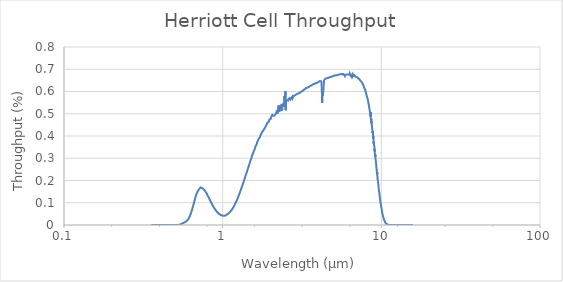
| Category | Throughput (%) |
|---|---|
| 0.355 | 0 |
| 0.365 | 0 |
| 0.375 | 0 |
| 0.385 | 0 |
| 0.395 | 0 |
| 0.405 | 0 |
| 0.415 | 0 |
| 0.425 | 0 |
| 0.435 | 0 |
| 0.445 | 0 |
| 0.455 | 0 |
| 0.465 | 0 |
| 0.475 | 0 |
| 0.485 | 0 |
| 0.495 | 0 |
| 0.505 | 0 |
| 0.515 | 0 |
| 0.525 | 0 |
| 0.535 | 0.001 |
| 0.545 | 0.003 |
| 0.555 | 0.006 |
| 0.565 | 0.009 |
| 0.575 | 0.012 |
| 0.585 | 0.015 |
| 0.595 | 0.019 |
| 0.605 | 0.025 |
| 0.615 | 0.033 |
| 0.625 | 0.045 |
| 0.635 | 0.059 |
| 0.645 | 0.075 |
| 0.655 | 0.092 |
| 0.665 | 0.11 |
| 0.675 | 0.127 |
| 0.685 | 0.141 |
| 0.695 | 0.15 |
| 0.705 | 0.157 |
| 0.715 | 0.161 |
| 0.725 | 0.169 |
| 0.735 | 0.168 |
| 0.745 | 0.165 |
| 0.755 | 0.163 |
| 0.765 | 0.158 |
| 0.775 | 0.152 |
| 0.785 | 0.147 |
| 0.795 | 0.139 |
| 0.805 | 0.131 |
| 0.815 | 0.125 |
| 0.825 | 0.117 |
| 0.835 | 0.11 |
| 0.845 | 0.102 |
| 0.855 | 0.095 |
| 0.865 | 0.088 |
| 0.875 | 0.082 |
| 0.885 | 0.076 |
| 0.895 | 0.071 |
| 0.905 | 0.066 |
| 0.915 | 0.061 |
| 0.925 | 0.058 |
| 0.935 | 0.054 |
| 0.945 | 0.051 |
| 0.955 | 0.048 |
| 0.965 | 0.046 |
| 0.975 | 0.045 |
| 0.985 | 0.043 |
| 0.995 | 0.042 |
| 1.005 | 0.042 |
| 1.015 | 0.042 |
| 1.025 | 0.042 |
| 1.035 | 0.042 |
| 1.045 | 0.043 |
| 1.055 | 0.046 |
| 1.065 | 0.047 |
| 1.075 | 0.049 |
| 1.085 | 0.051 |
| 1.095 | 0.053 |
| 1.105 | 0.056 |
| 1.115 | 0.059 |
| 1.125 | 0.062 |
| 1.135 | 0.066 |
| 1.145 | 0.07 |
| 1.155 | 0.074 |
| 1.165 | 0.078 |
| 1.175 | 0.083 |
| 1.185 | 0.088 |
| 1.195 | 0.093 |
| 1.205 | 0.099 |
| 1.215 | 0.104 |
| 1.225 | 0.11 |
| 1.235 | 0.115 |
| 1.245 | 0.121 |
| 1.255 | 0.128 |
| 1.265 | 0.134 |
| 1.275 | 0.14 |
| 1.285 | 0.147 |
| 1.295 | 0.154 |
| 1.305 | 0.16 |
| 1.315 | 0.167 |
| 1.325 | 0.173 |
| 1.335 | 0.18 |
| 1.345 | 0.187 |
| 1.355 | 0.193 |
| 1.365 | 0.201 |
| 1.375 | 0.207 |
| 1.385 | 0.215 |
| 1.395 | 0.223 |
| 1.405 | 0.227 |
| 1.415 | 0.234 |
| 1.425 | 0.241 |
| 1.435 | 0.249 |
| 1.445 | 0.256 |
| 1.455 | 0.261 |
| 1.465 | 0.268 |
| 1.475 | 0.275 |
| 1.485 | 0.28 |
| 1.495 | 0.288 |
| 1.505 | 0.293 |
| 1.515 | 0.299 |
| 1.525 | 0.306 |
| 1.535 | 0.311 |
| 1.545 | 0.317 |
| 1.555 | 0.321 |
| 1.565 | 0.329 |
| 1.575 | 0.331 |
| 1.585 | 0.338 |
| 1.595 | 0.343 |
| 1.605 | 0.35 |
| 1.615 | 0.351 |
| 1.625 | 0.358 |
| 1.635 | 0.362 |
| 1.645 | 0.366 |
| 1.655 | 0.374 |
| 1.665 | 0.377 |
| 1.675 | 0.377 |
| 1.685 | 0.386 |
| 1.695 | 0.386 |
| 1.705 | 0.39 |
| 1.715 | 0.394 |
| 1.725 | 0.4 |
| 1.735 | 0.401 |
| 1.745 | 0.407 |
| 1.755 | 0.41 |
| 1.765 | 0.415 |
| 1.775 | 0.418 |
| 1.785 | 0.42 |
| 1.795 | 0.423 |
| 1.805 | 0.425 |
| 1.815 | 0.427 |
| 1.825 | 0.428 |
| 1.835 | 0.434 |
| 1.845 | 0.436 |
| 1.855 | 0.439 |
| 1.865 | 0.442 |
| 1.875 | 0.446 |
| 1.885 | 0.446 |
| 1.895 | 0.453 |
| 1.905 | 0.452 |
| 1.915 | 0.461 |
| 1.925 | 0.464 |
| 1.935 | 0.461 |
| 1.945 | 0.462 |
| 1.955 | 0.465 |
| 1.965 | 0.465 |
| 1.975 | 0.475 |
| 1.985 | 0.471 |
| 1.995 | 0.477 |
| 2.005 | 0.476 |
| 2.015 | 0.482 |
| 2.025 | 0.487 |
| 2.035 | 0.487 |
| 2.045 | 0.49 |
| 2.055 | 0.495 |
| 2.065 | 0.493 |
| 2.075 | 0.493 |
| 2.085 | 0.491 |
| 2.095 | 0.495 |
| 2.105 | 0.494 |
| 2.115 | 0.493 |
| 2.125 | 0.493 |
| 2.135 | 0.496 |
| 2.145 | 0.493 |
| 2.155 | 0.498 |
| 2.165 | 0.502 |
| 2.175 | 0.498 |
| 2.185 | 0.508 |
| 2.195 | 0.514 |
| 2.205 | 0.511 |
| 2.215 | 0.501 |
| 2.225 | 0.517 |
| 2.235 | 0.51 |
| 2.245 | 0.508 |
| 2.255 | 0.537 |
| 2.265 | 0.51 |
| 2.275 | 0.521 |
| 2.285 | 0.511 |
| 2.295 | 0.527 |
| 2.305 | 0.526 |
| 2.315 | 0.532 |
| 2.325 | 0.519 |
| 2.335 | 0.528 |
| 2.345 | 0.534 |
| 2.355 | 0.541 |
| 2.365 | 0.514 |
| 2.375 | 0.522 |
| 2.385 | 0.545 |
| 2.395 | 0.547 |
| 2.405 | 0.546 |
| 2.415 | 0.532 |
| 2.425 | 0.534 |
| 2.435 | 0.553 |
| 2.445 | 0.537 |
| 2.455 | 0.579 |
| 2.465 | 0.558 |
| 2.475 | 0.579 |
| 2.485 | 0.602 |
| 2.495 | 0.516 |
| 2.505 | 0.557 |
| 2.515 | 0.557 |
| 2.525 | 0.557 |
| 2.535 | 0.56 |
| 2.545 | 0.559 |
| 2.555 | 0.56 |
| 2.565 | 0.562 |
| 2.575 | 0.561 |
| 2.585 | 0.56 |
| 2.595 | 0.565 |
| 2.61 | 0.562 |
| 2.619 | 0.565 |
| 2.63 | 0.568 |
| 2.64 | 0.57 |
| 2.65 | 0.569 |
| 2.659 | 0.569 |
| 2.67 | 0.564 |
| 2.68 | 0.56 |
| 2.689 | 0.564 |
| 2.7 | 0.57 |
| 2.71 | 0.57 |
| 2.719 | 0.574 |
| 2.73 | 0.57 |
| 2.739 | 0.568 |
| 2.749 | 0.577 |
| 2.76 | 0.57 |
| 2.769 | 0.573 |
| 2.78 | 0.575 |
| 2.789 | 0.574 |
| 2.8 | 0.579 |
| 2.809 | 0.581 |
| 2.82 | 0.58 |
| 2.829 | 0.581 |
| 2.839 | 0.582 |
| 2.849 | 0.583 |
| 2.859 | 0.583 |
| 2.87 | 0.584 |
| 2.879 | 0.585 |
| 2.889 | 0.586 |
| 2.899 | 0.586 |
| 2.909 | 0.587 |
| 2.919 | 0.587 |
| 2.929 | 0.588 |
| 2.939 | 0.589 |
| 2.949 | 0.588 |
| 2.959 | 0.59 |
| 2.969 | 0.592 |
| 2.979 | 0.591 |
| 2.989 | 0.591 |
| 2.999 | 0.591 |
| 3.009 | 0.592 |
| 3.019 | 0.593 |
| 3.029 | 0.592 |
| 3.039 | 0.594 |
| 3.049 | 0.595 |
| 3.059 | 0.594 |
| 3.069 | 0.596 |
| 3.079 | 0.595 |
| 3.089 | 0.597 |
| 3.099 | 0.597 |
| 3.109 | 0.598 |
| 3.119 | 0.599 |
| 3.129 | 0.599 |
| 3.139 | 0.6 |
| 3.149 | 0.6 |
| 3.159 | 0.601 |
| 3.169 | 0.602 |
| 3.179 | 0.603 |
| 3.189 | 0.603 |
| 3.199 | 0.602 |
| 3.209 | 0.604 |
| 3.219 | 0.605 |
| 3.229 | 0.606 |
| 3.239 | 0.607 |
| 3.249 | 0.608 |
| 3.259 | 0.609 |
| 3.269 | 0.608 |
| 3.279 | 0.61 |
| 3.289 | 0.61 |
| 3.299 | 0.611 |
| 3.309 | 0.611 |
| 3.319 | 0.611 |
| 3.329 | 0.612 |
| 3.339 | 0.613 |
| 3.349 | 0.614 |
| 3.359 | 0.616 |
| 3.369 | 0.615 |
| 3.379 | 0.615 |
| 3.389 | 0.616 |
| 3.399 | 0.616 |
| 3.409 | 0.617 |
| 3.419 | 0.616 |
| 3.429 | 0.616 |
| 3.439 | 0.618 |
| 3.449 | 0.618 |
| 3.459 | 0.62 |
| 3.469 | 0.62 |
| 3.479 | 0.622 |
| 3.489 | 0.621 |
| 3.499 | 0.621 |
| 3.509 | 0.622 |
| 3.519 | 0.622 |
| 3.529 | 0.621 |
| 3.539 | 0.623 |
| 3.549 | 0.625 |
| 3.559 | 0.626 |
| 3.569 | 0.625 |
| 3.579 | 0.625 |
| 3.589 | 0.626 |
| 3.599 | 0.626 |
| 3.609 | 0.626 |
| 3.619 | 0.628 |
| 3.629 | 0.628 |
| 3.639 | 0.628 |
| 3.649 | 0.629 |
| 3.659 | 0.629 |
| 3.669 | 0.629 |
| 3.679 | 0.629 |
| 3.689 | 0.631 |
| 3.699 | 0.632 |
| 3.709 | 0.632 |
| 3.719 | 0.633 |
| 3.729 | 0.634 |
| 3.739 | 0.633 |
| 3.749 | 0.632 |
| 3.759 | 0.633 |
| 3.769 | 0.635 |
| 3.779 | 0.634 |
| 3.789 | 0.635 |
| 3.799 | 0.635 |
| 3.809 | 0.636 |
| 3.819 | 0.635 |
| 3.829 | 0.637 |
| 3.839 | 0.636 |
| 3.849 | 0.637 |
| 3.859 | 0.638 |
| 3.869 | 0.637 |
| 3.879 | 0.638 |
| 3.889 | 0.638 |
| 3.899 | 0.64 |
| 3.909 | 0.64 |
| 3.919 | 0.64 |
| 3.929 | 0.638 |
| 3.939 | 0.639 |
| 3.949 | 0.639 |
| 3.959 | 0.641 |
| 3.968 | 0.641 |
| 3.979 | 0.642 |
| 3.989 | 0.641 |
| 3.999 | 0.641 |
| 4.009 | 0.643 |
| 4.018 | 0.643 |
| 4.029 | 0.645 |
| 4.039 | 0.644 |
| 4.049 | 0.644 |
| 4.058 | 0.646 |
| 4.069 | 0.646 |
| 4.078 | 0.646 |
| 4.089 | 0.645 |
| 4.098 | 0.646 |
| 4.109 | 0.646 |
| 4.118 | 0.647 |
| 4.129 | 0.648 |
| 4.138 | 0.649 |
| 4.148 | 0.648 |
| 4.159 | 0.65 |
| 4.168 | 0.649 |
| 4.178 | 0.649 |
| 4.189 | 0.645 |
| 4.198 | 0.635 |
| 4.208 | 0.62 |
| 4.218 | 0.603 |
| 4.228 | 0.557 |
| 4.238 | 0.55 |
| 4.248 | 0.565 |
| 4.258 | 0.596 |
| 4.268 | 0.583 |
| 4.278 | 0.582 |
| 4.288 | 0.585 |
| 4.298 | 0.594 |
| 4.308 | 0.602 |
| 4.318 | 0.61 |
| 4.328 | 0.626 |
| 4.338 | 0.634 |
| 4.348 | 0.639 |
| 4.358 | 0.649 |
| 4.368 | 0.652 |
| 4.378 | 0.653 |
| 4.388 | 0.654 |
| 4.398 | 0.657 |
| 4.408 | 0.656 |
| 4.418 | 0.655 |
| 4.428 | 0.656 |
| 4.438 | 0.656 |
| 4.448 | 0.657 |
| 4.458 | 0.658 |
| 4.468 | 0.659 |
| 4.478 | 0.658 |
| 4.488 | 0.658 |
| 4.498 | 0.659 |
| 4.508 | 0.659 |
| 4.518 | 0.659 |
| 4.528 | 0.66 |
| 4.538 | 0.66 |
| 4.548 | 0.66 |
| 4.558 | 0.659 |
| 4.568 | 0.661 |
| 4.578 | 0.661 |
| 4.588 | 0.661 |
| 4.598 | 0.661 |
| 4.608 | 0.66 |
| 4.618 | 0.661 |
| 4.628 | 0.662 |
| 4.638 | 0.661 |
| 4.648 | 0.663 |
| 4.658 | 0.664 |
| 4.668 | 0.663 |
| 4.678 | 0.663 |
| 4.688 | 0.663 |
| 4.698 | 0.663 |
| 4.708 | 0.663 |
| 4.718 | 0.664 |
| 4.728 | 0.664 |
| 4.738 | 0.665 |
| 4.748 | 0.665 |
| 4.758 | 0.665 |
| 4.768 | 0.666 |
| 4.778 | 0.666 |
| 4.788 | 0.665 |
| 4.798 | 0.666 |
| 4.808 | 0.666 |
| 4.818 | 0.666 |
| 4.828 | 0.666 |
| 4.838 | 0.667 |
| 4.848 | 0.667 |
| 4.858 | 0.667 |
| 4.868 | 0.668 |
| 4.878 | 0.667 |
| 4.888 | 0.667 |
| 4.898 | 0.667 |
| 4.908 | 0.669 |
| 4.918 | 0.669 |
| 4.928 | 0.669 |
| 4.938 | 0.669 |
| 4.948 | 0.669 |
| 4.958 | 0.669 |
| 4.968 | 0.669 |
| 4.978 | 0.669 |
| 4.988 | 0.67 |
| 4.998 | 0.669 |
| 5.008 | 0.669 |
| 5.018 | 0.669 |
| 5.028 | 0.67 |
| 5.038 | 0.672 |
| 5.048 | 0.672 |
| 5.058 | 0.672 |
| 5.068 | 0.672 |
| 5.078 | 0.671 |
| 5.088 | 0.671 |
| 5.098 | 0.672 |
| 5.107 | 0.673 |
| 5.118 | 0.673 |
| 5.128 | 0.672 |
| 5.138 | 0.672 |
| 5.147 | 0.672 |
| 5.158 | 0.672 |
| 5.168 | 0.673 |
| 5.178 | 0.673 |
| 5.187 | 0.674 |
| 5.198 | 0.674 |
| 5.208 | 0.673 |
| 5.218 | 0.674 |
| 5.227 | 0.674 |
| 5.238 | 0.674 |
| 5.248 | 0.675 |
| 5.257 | 0.675 |
| 5.268 | 0.674 |
| 5.278 | 0.674 |
| 5.288 | 0.674 |
| 5.297 | 0.674 |
| 5.308 | 0.676 |
| 5.318 | 0.675 |
| 5.327 | 0.675 |
| 5.337 | 0.676 |
| 5.348 | 0.674 |
| 5.358 | 0.674 |
| 5.367 | 0.675 |
| 5.378 | 0.677 |
| 5.388 | 0.677 |
| 5.397 | 0.677 |
| 5.407 | 0.675 |
| 5.418 | 0.674 |
| 5.428 | 0.673 |
| 5.437 | 0.674 |
| 5.448 | 0.677 |
| 5.458 | 0.676 |
| 5.467 | 0.674 |
| 5.477 | 0.674 |
| 5.488 | 0.675 |
| 5.497 | 0.677 |
| 5.507 | 0.677 |
| 5.518 | 0.676 |
| 5.527 | 0.677 |
| 5.537 | 0.678 |
| 5.548 | 0.677 |
| 5.558 | 0.676 |
| 5.567 | 0.677 |
| 5.578 | 0.676 |
| 5.588 | 0.677 |
| 5.597 | 0.678 |
| 5.608 | 0.678 |
| 5.618 | 0.678 |
| 5.627 | 0.679 |
| 5.637 | 0.678 |
| 5.648 | 0.675 |
| 5.657 | 0.676 |
| 5.667 | 0.677 |
| 5.678 | 0.678 |
| 5.687 | 0.677 |
| 5.697 | 0.678 |
| 5.707 | 0.678 |
| 5.717 | 0.673 |
| 5.727 | 0.674 |
| 5.737 | 0.676 |
| 5.747 | 0.678 |
| 5.758 | 0.678 |
| 5.767 | 0.676 |
| 5.777 | 0.674 |
| 5.788 | 0.678 |
| 5.797 | 0.679 |
| 5.807 | 0.68 |
| 5.818 | 0.677 |
| 5.827 | 0.674 |
| 5.837 | 0.675 |
| 5.847 | 0.679 |
| 5.857 | 0.678 |
| 5.867 | 0.677 |
| 5.877 | 0.675 |
| 5.887 | 0.67 |
| 5.898 | 0.672 |
| 5.907 | 0.675 |
| 5.917 | 0.677 |
| 5.927 | 0.676 |
| 5.937 | 0.673 |
| 5.947 | 0.672 |
| 5.957 | 0.676 |
| 5.967 | 0.677 |
| 5.978 | 0.677 |
| 5.987 | 0.676 |
| 5.997 | 0.676 |
| 6.007 | 0.677 |
| 6.017 | 0.677 |
| 6.027 | 0.678 |
| 6.037 | 0.68 |
| 6.047 | 0.679 |
| 6.057 | 0.672 |
| 6.067 | 0.672 |
| 6.077 | 0.672 |
| 6.087 | 0.677 |
| 6.097 | 0.678 |
| 6.107 | 0.677 |
| 6.117 | 0.674 |
| 6.127 | 0.675 |
| 6.137 | 0.676 |
| 6.147 | 0.675 |
| 6.157 | 0.674 |
| 6.167 | 0.675 |
| 6.177 | 0.677 |
| 6.187 | 0.676 |
| 6.197 | 0.676 |
| 6.207 | 0.677 |
| 6.217 | 0.677 |
| 6.227 | 0.677 |
| 6.237 | 0.678 |
| 6.247 | 0.679 |
| 6.257 | 0.679 |
| 6.267 | 0.678 |
| 6.277 | 0.676 |
| 6.287 | 0.676 |
| 6.297 | 0.677 |
| 6.307 | 0.679 |
| 6.317 | 0.682 |
| 6.327 | 0.682 |
| 6.337 | 0.679 |
| 6.347 | 0.676 |
| 6.357 | 0.677 |
| 6.367 | 0.677 |
| 6.377 | 0.676 |
| 6.387 | 0.677 |
| 6.397 | 0.68 |
| 6.407 | 0.678 |
| 6.417 | 0.672 |
| 6.427 | 0.67 |
| 6.437 | 0.671 |
| 6.446 | 0.673 |
| 6.457 | 0.676 |
| 6.467 | 0.676 |
| 6.477 | 0.675 |
| 6.487 | 0.672 |
| 6.497 | 0.67 |
| 6.507 | 0.671 |
| 6.517 | 0.672 |
| 6.527 | 0.673 |
| 6.537 | 0.674 |
| 6.547 | 0.674 |
| 6.557 | 0.674 |
| 6.567 | 0.67 |
| 6.577 | 0.669 |
| 6.587 | 0.669 |
| 6.597 | 0.672 |
| 6.607 | 0.673 |
| 6.617 | 0.674 |
| 6.627 | 0.67 |
| 6.637 | 0.667 |
| 6.647 | 0.668 |
| 6.657 | 0.671 |
| 6.666 | 0.674 |
| 6.677 | 0.673 |
| 6.686 | 0.673 |
| 6.697 | 0.673 |
| 6.706 | 0.672 |
| 6.717 | 0.67 |
| 6.726 | 0.671 |
| 6.737 | 0.675 |
| 6.746 | 0.675 |
| 6.757 | 0.676 |
| 6.766 | 0.674 |
| 6.777 | 0.672 |
| 6.787 | 0.67 |
| 6.797 | 0.672 |
| 6.807 | 0.673 |
| 6.816 | 0.674 |
| 6.827 | 0.673 |
| 6.836 | 0.672 |
| 6.847 | 0.672 |
| 6.856 | 0.67 |
| 6.867 | 0.667 |
| 6.876 | 0.668 |
| 6.887 | 0.67 |
| 6.897 | 0.67 |
| 6.906 | 0.669 |
| 6.917 | 0.668 |
| 6.926 | 0.669 |
| 6.937 | 0.669 |
| 6.946 | 0.669 |
| 6.956 | 0.667 |
| 6.967 | 0.665 |
| 6.976 | 0.665 |
| 6.987 | 0.666 |
| 6.996 | 0.666 |
| 7.007 | 0.665 |
| 7.016 | 0.665 |
| 7.026 | 0.664 |
| 7.037 | 0.662 |
| 7.046 | 0.661 |
| 7.057 | 0.661 |
| 7.066 | 0.663 |
| 7.076 | 0.663 |
| 7.087 | 0.663 |
| 7.096 | 0.663 |
| 7.107 | 0.662 |
| 7.116 | 0.661 |
| 7.126 | 0.661 |
| 7.137 | 0.66 |
| 7.146 | 0.659 |
| 7.156 | 0.658 |
| 7.166 | 0.658 |
| 7.176 | 0.659 |
| 7.187 | 0.659 |
| 7.196 | 0.659 |
| 7.206 | 0.658 |
| 7.217 | 0.658 |
| 7.226 | 0.658 |
| 7.236 | 0.659 |
| 7.246 | 0.658 |
| 7.256 | 0.657 |
| 7.266 | 0.656 |
| 7.276 | 0.655 |
| 7.286 | 0.655 |
| 7.296 | 0.656 |
| 7.306 | 0.656 |
| 7.316 | 0.655 |
| 7.327 | 0.654 |
| 7.336 | 0.652 |
| 7.346 | 0.65 |
| 7.357 | 0.65 |
| 7.366 | 0.65 |
| 7.376 | 0.651 |
| 7.386 | 0.651 |
| 7.396 | 0.651 |
| 7.406 | 0.651 |
| 7.416 | 0.65 |
| 7.426 | 0.65 |
| 7.436 | 0.649 |
| 7.446 | 0.647 |
| 7.456 | 0.646 |
| 7.466 | 0.644 |
| 7.476 | 0.643 |
| 7.486 | 0.644 |
| 7.496 | 0.644 |
| 7.506 | 0.644 |
| 7.516 | 0.643 |
| 7.526 | 0.642 |
| 7.536 | 0.641 |
| 7.546 | 0.641 |
| 7.556 | 0.64 |
| 7.566 | 0.64 |
| 7.576 | 0.639 |
| 7.586 | 0.638 |
| 7.596 | 0.637 |
| 7.606 | 0.637 |
| 7.616 | 0.636 |
| 7.626 | 0.635 |
| 7.636 | 0.634 |
| 7.646 | 0.633 |
| 7.656 | 0.633 |
| 7.666 | 0.632 |
| 7.676 | 0.63 |
| 7.686 | 0.629 |
| 7.696 | 0.628 |
| 7.706 | 0.628 |
| 7.716 | 0.627 |
| 7.726 | 0.626 |
| 7.736 | 0.625 |
| 7.746 | 0.623 |
| 7.756 | 0.622 |
| 7.766 | 0.621 |
| 7.776 | 0.62 |
| 7.786 | 0.619 |
| 7.796 | 0.618 |
| 7.806 | 0.617 |
| 7.816 | 0.616 |
| 7.826 | 0.615 |
| 7.836 | 0.614 |
| 7.846 | 0.614 |
| 7.855 | 0.613 |
| 7.866 | 0.612 |
| 7.876 | 0.611 |
| 7.886 | 0.61 |
| 7.896 | 0.608 |
| 7.905 | 0.606 |
| 7.916 | 0.604 |
| 7.926 | 0.603 |
| 7.936 | 0.602 |
| 7.946 | 0.601 |
| 7.955 | 0.6 |
| 7.966 | 0.599 |
| 7.976 | 0.598 |
| 7.986 | 0.597 |
| 7.996 | 0.595 |
| 8.005 | 0.594 |
| 8.016 | 0.592 |
| 8.026 | 0.591 |
| 8.036 | 0.589 |
| 8.046 | 0.587 |
| 8.056 | 0.586 |
| 8.065 | 0.585 |
| 8.075 | 0.584 |
| 8.086 | 0.582 |
| 8.096 | 0.581 |
| 8.106 | 0.579 |
| 8.116 | 0.577 |
| 8.125 | 0.576 |
| 8.135 | 0.574 |
| 8.146 | 0.573 |
| 8.156 | 0.572 |
| 8.166 | 0.571 |
| 8.176 | 0.57 |
| 8.186 | 0.569 |
| 8.195 | 0.567 |
| 8.205 | 0.565 |
| 8.215 | 0.564 |
| 8.226 | 0.562 |
| 8.236 | 0.559 |
| 8.246 | 0.557 |
| 8.256 | 0.555 |
| 8.266 | 0.554 |
| 8.275 | 0.552 |
| 8.285 | 0.551 |
| 8.295 | 0.548 |
| 8.305 | 0.546 |
| 8.315 | 0.544 |
| 8.326 | 0.541 |
| 8.336 | 0.539 |
| 8.346 | 0.537 |
| 8.356 | 0.535 |
| 8.366 | 0.533 |
| 8.375 | 0.531 |
| 8.385 | 0.528 |
| 8.395 | 0.526 |
| 8.405 | 0.524 |
| 8.415 | 0.522 |
| 8.425 | 0.52 |
| 8.435 | 0.518 |
| 8.445 | 0.516 |
| 8.455 | 0.513 |
| 8.465 | 0.51 |
| 8.476 | 0.508 |
| 8.486 | 0.505 |
| 8.496 | 0.503 |
| 8.506 | 0.501 |
| 8.516 | 0.502 |
| 8.526 | 0.503 |
| 8.536 | 0.494 |
| 8.555 | 0.489 |
| 8.565 | 0.507 |
| 8.575 | 0.488 |
| 8.585 | 0.485 |
| 8.595 | 0.478 |
| 8.605 | 0.474 |
| 8.615 | 0.47 |
| 8.625 | 0.479 |
| 8.635 | 0.469 |
| 8.645 | 0.463 |
| 8.655 | 0.457 |
| 8.665 | 0.462 |
| 8.675 | 0.468 |
| 8.685 | 0.463 |
| 8.695 | 0.454 |
| 8.705 | 0.449 |
| 8.715 | 0.452 |
| 8.735 | 0.439 |
| 8.745 | 0.435 |
| 8.755 | 0.433 |
| 8.765 | 0.436 |
| 8.775 | 0.428 |
| 8.785 | 0.426 |
| 8.795 | 0.424 |
| 8.805 | 0.414 |
| 8.815 | 0.42 |
| 8.825 | 0.417 |
| 8.835 | 0.416 |
| 8.845 | 0.416 |
| 8.855 | 0.418 |
| 8.865 | 0.406 |
| 8.875 | 0.399 |
| 8.885 | 0.389 |
| 8.895 | 0.398 |
| 8.905 | 0.388 |
| 8.925 | 0.386 |
| 8.935 | 0.379 |
| 8.945 | 0.382 |
| 8.955 | 0.365 |
| 8.965 | 0.374 |
| 8.975 | 0.376 |
| 8.985 | 0.365 |
| 8.995 | 0.359 |
| 9.005 | 0.361 |
| 9.015 | 0.357 |
| 9.035 | 0.354 |
| 9.045 | 0.35 |
| 9.055 | 0.342 |
| 9.065 | 0.336 |
| 9.075 | 0.341 |
| 9.085 | 0.328 |
| 9.095 | 0.332 |
| 9.115 | 0.319 |
| 9.125 | 0.322 |
| 9.135 | 0.318 |
| 9.145 | 0.311 |
| 9.155 | 0.317 |
| 9.175 | 0.305 |
| 9.185 | 0.307 |
| 9.195 | 0.297 |
| 9.205 | 0.294 |
| 9.215 | 0.291 |
| 9.235 | 0.289 |
| 9.245 | 0.287 |
| 9.255 | 0.281 |
| 9.265 | 0.279 |
| 9.275 | 0.273 |
| 9.295 | 0.267 |
| 9.305 | 0.259 |
| 9.314 | 0.259 |
| 9.325 | 0.254 |
| 9.345 | 0.251 |
| 9.355 | 0.248 |
| 9.364 | 0.247 |
| 9.375 | 0.237 |
| 9.385 | 0.24 |
| 9.395 | 0.232 |
| 9.404 | 0.231 |
| 9.415 | 0.237 |
| 9.425 | 0.224 |
| 9.435 | 0.228 |
| 9.444 | 0.223 |
| 9.455 | 0.221 |
| 9.465 | 0.212 |
| 9.475 | 0.207 |
| 9.484 | 0.208 |
| 9.495 | 0.202 |
| 9.505 | 0.203 |
| 9.515 | 0.198 |
| 9.524 | 0.204 |
| 9.535 | 0.194 |
| 9.545 | 0.196 |
| 9.554 | 0.191 |
| 9.564 | 0.184 |
| 9.575 | 0.181 |
| 9.585 | 0.181 |
| 9.594 | 0.177 |
| 9.605 | 0.171 |
| 9.615 | 0.17 |
| 9.624 | 0.164 |
| 9.634 | 0.163 |
| 9.645 | 0.157 |
| 9.654 | 0.159 |
| 9.664 | 0.161 |
| 9.675 | 0.152 |
| 9.684 | 0.155 |
| 9.694 | 0.147 |
| 9.705 | 0.146 |
| 9.714 | 0.146 |
| 9.724 | 0.141 |
| 9.735 | 0.136 |
| 9.744 | 0.132 |
| 9.754 | 0.136 |
| 9.765 | 0.131 |
| 9.774 | 0.127 |
| 9.784 | 0.125 |
| 9.795 | 0.12 |
| 9.804 | 0.122 |
| 9.815 | 0.118 |
| 9.824 | 0.115 |
| 9.834 | 0.115 |
| 9.845 | 0.113 |
| 9.854 | 0.111 |
| 9.864 | 0.106 |
| 9.875 | 0.101 |
| 9.884 | 0.103 |
| 9.895 | 0.099 |
| 9.904 | 0.098 |
| 9.914 | 0.098 |
| 9.924 | 0.093 |
| 9.934 | 0.092 |
| 9.945 | 0.089 |
| 9.954 | 0.088 |
| 9.964 | 0.083 |
| 9.974 | 0.082 |
| 9.984 | 0.079 |
| 9.994 | 0.08 |
| 10.004 | 0.08 |
| 10.015 | 0.077 |
| 10.024 | 0.079 |
| 10.034 | 0.073 |
| 10.044 | 0.074 |
| 10.054 | 0.071 |
| 10.064 | 0.068 |
| 10.074 | 0.067 |
| 10.084 | 0.065 |
| 10.094 | 0.062 |
| 10.104 | 0.062 |
| 10.114 | 0.056 |
| 10.124 | 0.059 |
| 10.134 | 0.056 |
| 10.144 | 0.055 |
| 10.154 | 0.052 |
| 10.164 | 0.053 |
| 10.174 | 0.051 |
| 10.184 | 0.052 |
| 10.194 | 0.047 |
| 10.204 | 0.047 |
| 10.214 | 0.045 |
| 10.224 | 0.044 |
| 10.234 | 0.041 |
| 10.244 | 0.039 |
| 10.254 | 0.041 |
| 10.264 | 0.04 |
| 10.274 | 0.037 |
| 10.284 | 0.037 |
| 10.294 | 0.037 |
| 10.304 | 0.034 |
| 10.314 | 0.032 |
| 10.324 | 0.033 |
| 10.334 | 0.032 |
| 10.344 | 0.029 |
| 10.354 | 0.029 |
| 10.364 | 0.027 |
| 10.374 | 0.028 |
| 10.384 | 0.027 |
| 10.394 | 0.026 |
| 10.404 | 0.024 |
| 10.414 | 0.026 |
| 10.424 | 0.023 |
| 10.434 | 0.023 |
| 10.444 | 0.021 |
| 10.454 | 0.02 |
| 10.464 | 0.02 |
| 10.474 | 0.019 |
| 10.484 | 0.019 |
| 10.494 | 0.017 |
| 10.504 | 0.016 |
| 10.514 | 0.017 |
| 10.524 | 0.017 |
| 10.534 | 0.015 |
| 10.544 | 0.014 |
| 10.554 | 0.014 |
| 10.564 | 0.012 |
| 10.574 | 0.012 |
| 10.584 | 0.013 |
| 10.594 | 0.012 |
| 10.604 | 0.01 |
| 10.614 | 0.01 |
| 10.624 | 0.011 |
| 10.634 | 0.011 |
| 10.644 | 0.009 |
| 10.654 | 0.009 |
| 10.664 | 0.008 |
| 10.674 | 0.009 |
| 10.684 | 0.008 |
| 10.694 | 0.007 |
| 10.704 | 0.007 |
| 10.714 | 0.008 |
| 10.723 | 0.006 |
| 10.734 | 0.005 |
| 10.744 | 0.006 |
| 10.754 | 0.005 |
| 10.763 | 0.005 |
| 10.774 | 0.006 |
| 10.784 | 0.004 |
| 10.794 | 0.005 |
| 10.803 | 0.004 |
| 10.814 | 0.004 |
| 10.824 | 0.003 |
| 10.834 | 0.004 |
| 10.843 | 0.004 |
| 10.854 | 0.003 |
| 10.864 | 0.003 |
| 10.874 | 0.003 |
| 10.883 | 0.003 |
| 10.893 | 0.003 |
| 10.904 | 0.002 |
| 10.914 | 0.003 |
| 10.924 | 0.002 |
| 10.933 | 0.002 |
| 10.943 | 0.002 |
| 10.954 | 0.002 |
| 10.964 | 0.002 |
| 10.974 | 0.002 |
| 10.984 | 0.002 |
| 10.993 | 0.001 |
| 11.003 | 0.001 |
| 11.014 | 0.001 |
| 11.024 | 0.001 |
| 11.034 | 0.001 |
| 11.044 | 0.001 |
| 11.053 | 0.001 |
| 11.063 | 0.001 |
| 11.073 | 0.001 |
| 11.083 | 0.001 |
| 11.094 | 0.001 |
| 11.104 | 0.001 |
| 11.114 | 0.001 |
| 11.124 | 0.001 |
| 11.133 | 0.001 |
| 11.143 | 0.001 |
| 11.153 | 0.001 |
| 11.163 | 0.001 |
| 11.173 | 0.001 |
| 11.183 | 0.001 |
| 11.193 | 0 |
| 11.204 | 0 |
| 11.214 | 0 |
| 11.224 | 0 |
| 11.234 | 0 |
| 11.244 | 0 |
| 11.254 | 0 |
| 11.264 | 0 |
| 11.273 | 0 |
| 11.283 | 0 |
| 11.293 | 0 |
| 11.303 | 0 |
| 11.313 | 0 |
| 11.323 | 0 |
| 11.333 | 0 |
| 11.343 | 0 |
| 11.353 | 0 |
| 11.363 | 0 |
| 11.373 | 0 |
| 11.383 | 0 |
| 11.393 | 0 |
| 11.403 | 0 |
| 11.413 | 0 |
| 11.423 | 0 |
| 11.433 | 0 |
| 11.443 | 0 |
| 11.453 | 0 |
| 11.464 | 0 |
| 11.474 | 0 |
| 11.483 | 0 |
| 11.493 | 0 |
| 11.503 | 0 |
| 11.513 | 0 |
| 11.523 | 0 |
| 11.533 | 0 |
| 11.543 | 0 |
| 11.553 | 0 |
| 11.563 | 0 |
| 11.573 | 0 |
| 11.583 | 0 |
| 11.593 | 0 |
| 11.603 | 0 |
| 11.613 | 0 |
| 11.623 | 0 |
| 11.633 | 0 |
| 11.643 | 0 |
| 11.653 | 0 |
| 11.663 | 0 |
| 11.673 | 0 |
| 11.683 | 0 |
| 11.693 | 0 |
| 11.703 | 0 |
| 11.713 | 0 |
| 11.723 | 0 |
| 11.733 | 0 |
| 11.743 | 0 |
| 11.753 | 0 |
| 11.763 | 0 |
| 11.773 | 0 |
| 11.783 | 0 |
| 11.793 | 0 |
| 11.803 | 0 |
| 11.813 | 0 |
| 11.823 | 0 |
| 11.833 | 0 |
| 11.843 | 0 |
| 11.853 | 0 |
| 11.863 | 0 |
| 11.873 | 0 |
| 11.883 | 0 |
| 11.893 | 0 |
| 11.903 | 0 |
| 11.913 | 0 |
| 11.923 | 0 |
| 11.933 | 0 |
| 11.943 | 0 |
| 11.953 | 0 |
| 11.963 | 0 |
| 11.973 | 0 |
| 11.983 | 0 |
| 11.993 | 0 |
| 12.003 | 0 |
| 12.013 | 0 |
| 12.023 | 0 |
| 12.033 | 0 |
| 12.043 | 0 |
| 12.053 | 0 |
| 12.063 | 0 |
| 12.073 | 0 |
| 12.083 | 0 |
| 12.093 | 0 |
| 12.103 | 0 |
| 12.113 | 0 |
| 12.122 | 0 |
| 12.133 | 0 |
| 12.143 | 0 |
| 12.153 | 0 |
| 12.163 | 0 |
| 12.172 | 0 |
| 12.183 | 0 |
| 12.193 | 0 |
| 12.203 | 0 |
| 12.213 | 0 |
| 12.223 | 0 |
| 12.233 | 0 |
| 12.242 | 0 |
| 12.253 | 0 |
| 12.262 | 0 |
| 12.273 | 0 |
| 12.282 | 0 |
| 12.293 | 0 |
| 12.302 | 0 |
| 12.313 | 0 |
| 12.323 | 0 |
| 12.333 | 0 |
| 12.342 | 0 |
| 12.353 | 0 |
| 12.362 | 0 |
| 12.373 | 0 |
| 12.382 | 0 |
| 12.393 | 0 |
| 12.402 | 0 |
| 12.413 | 0 |
| 12.422 | 0 |
| 12.433 | 0 |
| 12.442 | 0 |
| 12.452 | 0 |
| 12.463 | 0 |
| 12.472 | 0 |
| 12.483 | 0 |
| 12.492 | 0 |
| 12.503 | 0 |
| 12.513 | 0 |
| 12.522 | 0 |
| 12.533 | 0 |
| 12.542 | 0 |
| 12.552 | 0 |
| 12.563 | 0 |
| 12.572 | 0 |
| 12.583 | 0 |
| 12.593 | 0 |
| 12.602 | 0 |
| 12.613 | 0 |
| 12.622 | 0 |
| 12.632 | 0 |
| 12.643 | 0 |
| 12.653 | 0 |
| 12.662 | 0 |
| 12.672 | 0 |
| 12.683 | 0 |
| 12.692 | 0 |
| 12.702 | 0 |
| 12.713 | 0 |
| 12.722 | 0 |
| 12.732 | 0 |
| 12.742 | 0 |
| 12.753 | 0 |
| 12.762 | 0 |
| 12.772 | 0 |
| 12.782 | 0 |
| 12.793 | 0 |
| 12.802 | 0 |
| 12.812 | 0 |
| 12.822 | 0 |
| 12.832 | 0 |
| 12.843 | 0 |
| 12.852 | 0 |
| 12.862 | 0 |
| 12.872 | 0 |
| 12.882 | 0 |
| 12.892 | 0 |
| 12.902 | 0 |
| 12.912 | 0 |
| 12.922 | 0 |
| 12.932 | 0 |
| 12.942 | 0 |
| 12.952 | 0 |
| 12.962 | 0 |
| 12.972 | 0 |
| 12.982 | 0 |
| 12.992 | 0 |
| 13.002 | 0 |
| 13.012 | 0 |
| 13.022 | 0 |
| 13.032 | 0 |
| 13.042 | 0 |
| 13.052 | 0 |
| 13.062 | 0 |
| 13.072 | 0 |
| 13.082 | 0 |
| 13.092 | 0 |
| 13.102 | 0 |
| 13.112 | 0 |
| 13.122 | 0 |
| 13.132 | 0 |
| 13.142 | 0 |
| 13.152 | 0 |
| 13.162 | 0 |
| 13.172 | 0 |
| 13.182 | 0 |
| 13.192 | 0 |
| 13.202 | 0 |
| 13.212 | 0 |
| 13.222 | 0 |
| 13.232 | 0 |
| 13.242 | 0 |
| 13.252 | 0 |
| 13.262 | 0 |
| 13.272 | 0 |
| 13.282 | 0 |
| 13.292 | 0 |
| 13.302 | 0 |
| 13.312 | 0 |
| 13.322 | 0 |
| 13.332 | 0 |
| 13.342 | 0 |
| 13.352 | 0 |
| 13.362 | 0 |
| 13.372 | 0 |
| 13.382 | 0 |
| 13.392 | 0 |
| 13.402 | 0 |
| 13.412 | 0 |
| 13.422 | 0 |
| 13.432 | 0 |
| 13.442 | 0 |
| 13.452 | 0 |
| 13.462 | 0 |
| 13.472 | 0 |
| 13.482 | 0 |
| 13.492 | 0 |
| 13.502 | 0 |
| 13.512 | 0 |
| 13.522 | 0 |
| 13.532 | 0 |
| 13.542 | 0 |
| 13.551 | 0 |
| 13.562 | 0 |
| 13.572 | 0 |
| 13.582 | 0 |
| 13.592 | 0 |
| 13.602 | 0 |
| 13.612 | 0 |
| 13.621 | 0 |
| 13.632 | 0 |
| 13.642 | 0 |
| 13.651 | 0 |
| 13.662 | 0 |
| 13.672 | 0 |
| 13.682 | 0 |
| 13.692 | 0 |
| 13.701 | 0 |
| 13.712 | 0 |
| 13.722 | 0 |
| 13.731 | 0 |
| 13.742 | 0 |
| 13.751 | 0 |
| 13.762 | 0 |
| 13.772 | 0 |
| 13.782 | 0 |
| 13.792 | 0 |
| 13.801 | 0 |
| 13.812 | 0 |
| 13.821 | 0 |
| 13.832 | 0 |
| 13.841 | 0 |
| 13.852 | 0 |
| 13.861 | 0 |
| 13.872 | 0 |
| 13.881 | 0 |
| 13.892 | 0 |
| 13.901 | 0 |
| 13.912 | 0 |
| 13.921 | 0 |
| 13.932 | 0 |
| 13.941 | 0 |
| 13.951 | 0 |
| 13.962 | 0 |
| 13.971 | 0 |
| 13.982 | 0 |
| 13.991 | 0 |
| 14.001 | 0 |
| 14.012 | 0 |
| 14.021 | 0 |
| 14.032 | 0 |
| 14.041 | 0 |
| 14.051 | 0 |
| 14.062 | 0 |
| 14.071 | 0 |
| 14.081 | 0 |
| 14.092 | 0 |
| 14.101 | 0 |
| 14.111 | 0 |
| 14.122 | 0 |
| 14.131 | 0 |
| 14.141 | 0 |
| 14.151 | 0 |
| 14.162 | 0 |
| 14.171 | 0 |
| 14.181 | 0 |
| 14.191 | 0 |
| 14.202 | 0 |
| 14.211 | 0 |
| 14.221 | 0 |
| 14.231 | 0 |
| 14.241 | 0 |
| 14.251 | 0 |
| 14.261 | 0 |
| 14.271 | 0 |
| 14.281 | 0 |
| 14.291 | 0 |
| 14.301 | 0 |
| 14.311 | 0 |
| 14.321 | 0 |
| 14.331 | 0 |
| 14.341 | 0 |
| 14.351 | 0 |
| 14.361 | 0 |
| 14.371 | 0 |
| 14.381 | 0 |
| 14.391 | 0 |
| 14.401 | 0 |
| 14.411 | 0 |
| 14.421 | 0 |
| 14.431 | 0 |
| 14.441 | 0 |
| 14.451 | 0 |
| 14.461 | 0 |
| 14.471 | 0 |
| 14.481 | 0 |
| 14.491 | 0 |
| 14.501 | 0 |
| 14.511 | 0 |
| 14.521 | 0 |
| 14.531 | 0 |
| 14.541 | 0 |
| 14.551 | 0 |
| 14.561 | 0 |
| 14.571 | 0 |
| 14.581 | 0 |
| 14.591 | 0 |
| 14.601 | 0 |
| 14.611 | 0 |
| 14.621 | 0 |
| 14.631 | 0 |
| 14.641 | 0 |
| 14.651 | 0 |
| 14.661 | 0 |
| 14.671 | 0 |
| 14.681 | 0 |
| 14.691 | 0 |
| 14.701 | 0 |
| 14.711 | 0 |
| 14.721 | 0 |
| 14.731 | 0 |
| 14.741 | 0 |
| 14.751 | 0 |
| 14.761 | 0 |
| 14.771 | 0 |
| 14.781 | 0 |
| 14.791 | 0 |
| 14.801 | 0 |
| 14.811 | 0 |
| 14.821 | 0 |
| 14.831 | 0 |
| 14.841 | 0 |
| 14.851 | 0 |
| 14.861 | 0 |
| 14.871 | 0 |
| 14.881 | 0 |
| 14.891 | 0 |
| 14.901 | 0 |
| 14.911 | 0 |
| 14.921 | 0 |
| 14.931 | 0 |
| 14.941 | 0 |
| 14.951 | 0 |
| 14.96 | 0 |
| 14.971 | 0 |
| 14.981 | 0 |
| 14.991 | 0 |
| 15.001 | 0 |
| 15.011 | 0 |
| 15.021 | 0 |
| 15.031 | 0 |
| 15.041 | 0 |
| 15.051 | 0 |
| 15.06 | 0 |
| 15.071 | 0 |
| 15.08 | 0 |
| 15.091 | 0 |
| 15.101 | 0 |
| 15.111 | 0 |
| 15.121 | 0 |
| 15.13 | 0 |
| 15.141 | 0 |
| 15.151 | 0 |
| 15.161 | 0 |
| 15.171 | 0 |
| 15.18 | 0 |
| 15.191 | 0 |
| 15.201 | 0 |
| 15.21 | 0 |
| 15.22 | 0 |
| 15.231 | 0 |
| 15.241 | 0 |
| 15.25 | 0 |
| 15.261 | 0 |
| 15.271 | 0 |
| 15.281 | 0 |
| 15.29 | 0 |
| 15.3 | 0 |
| 15.311 | 0 |
| 15.321 | 0 |
| 15.33 | 0 |
| 15.34 | 0 |
| 15.35 | 0 |
| 15.36 | 0 |
| 15.371 | 0 |
| 15.381 | 0 |
| 15.391 | 0 |
| 15.4 | 0 |
| 15.41 | 0 |
| 15.42 | 0 |
| 15.43 | 0 |
| 15.44 | 0 |
| 15.45 | 0 |
| 15.46 | 0 |
| 15.47 | 0 |
| 15.48 | 0 |
| 15.49 | 0 |
| 15.5 | 0 |
| 15.51 | 0 |
| 15.52 | 0 |
| 15.53 | 0 |
| 15.54 | 0 |
| 15.55 | 0 |
| 15.56 | 0 |
| 15.57 | 0 |
| 15.58 | 0 |
| 15.59 | 0 |
| 15.6 | 0 |
| 15.61 | 0 |
| 15.621 | 0 |
| 15.63 | 0 |
| 15.64 | 0 |
| 15.65 | 0 |
| 15.66 | 0 |
| 15.67 | 0 |
| 15.68 | 0 |
| 15.69 | 0 |
| 15.7 | 0 |
| 15.71 | 0 |
| 15.72 | 0 |
| 15.73 | 0 |
| 15.74 | 0 |
| 15.75 | 0 |
| 15.76 | 0 |
| 15.77 | 0 |
| 15.78 | 0 |
| 15.79 | 0 |
| 15.8 | 0 |
| 15.81 | 0 |
| 15.82 | 0 |
| 15.83 | 0 |
| 15.84 | 0 |
| 15.85 | 0 |
| 15.86 | 0 |
| 15.87 | 0 |
| 15.88 | 0 |
| 15.89 | 0 |
| 15.9 | 0 |
| 15.91 | 0 |
| 15.92 | 0 |
| 15.93 | 0 |
| 15.94 | 0 |
| 15.95 | 0 |
| 15.96 | 0 |
| 15.97 | 0 |
| 15.98 | 0 |
| 15.99 | 0 |
| 16.0 | 0 |